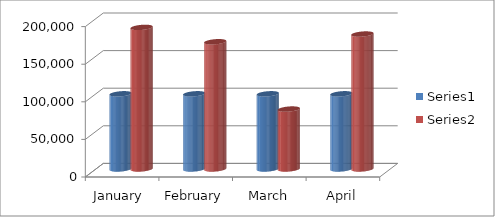
| Category | Series 0 | Series 1 |
|---|---|---|
| January  | 100000 | 188320 |
| February | 100000 | 169220 |
| March | 100000 | 79725 |
| April | 100000 | 179475 |